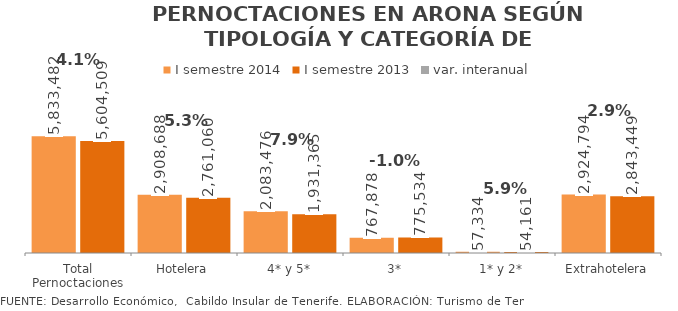
| Category | I semestre 2014 | I semestre 2013 |
|---|---|---|
| Total Pernoctaciones | 5833482 | 5604509 |
| Hotelera | 2908688 | 2761060 |
| 4* y 5* | 2083476 | 1931365 |
| 3* | 767878 | 775534 |
| 1* y 2* | 57334 | 54161 |
| Extrahotelera | 2924794 | 2843449 |